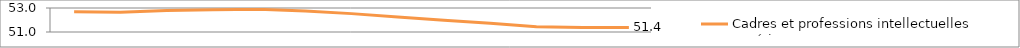
| Category | Cadres et professions intellectuelles supérieures |
|---|---|
| 2007.0 | 52.68 |
| 2008.0 | 52.643 |
| 2009.0 | 52.8 |
| 2010.0 | 52.854 |
| 2011.0 | 52.892 |
| 2012.0 | 52.741 |
| 2013.0 | 52.531 |
| 2014.0 | 52.257 |
| 2015.0 | 51.976 |
| 2016.0 | 51.726 |
| 2017.0 | 51.428 |
| 2018.0 | 51.379 |
| 2019.0 | 51.385 |